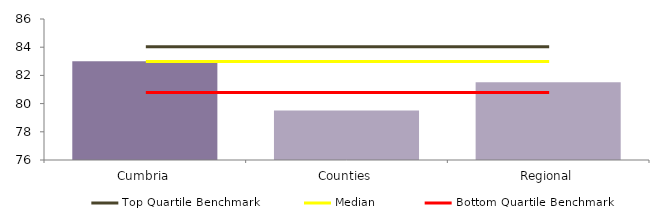
| Category | Block Data |
|---|---|
| Cumbria | 83.003 |
| Counties | 79.514 |
| Regional | 81.521 |